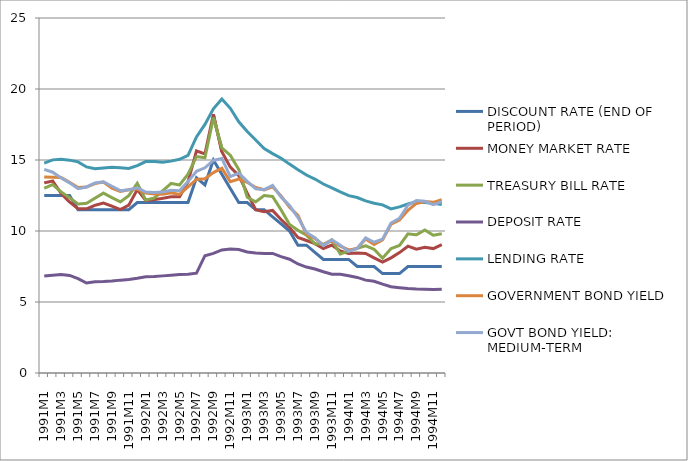
| Category | DISCOUNT RATE (END OF PERIOD) | MONEY MARKET RATE | TREASURY BILL RATE | DEPOSIT RATE | LENDING RATE | GOVERNMENT BOND YIELD | GOVT BOND YIELD: MEDIUM-TERM |
|---|---|---|---|---|---|---|---|
| 1991M1 | 12.5 | 13.39 | 13.01 | 6.83 | 14.78 | 13.8 | 14.34 |
| 1991M2 | 12.5 | 13.52 | 13.27 | 6.89 | 15.01 | 13.78 | 14.14 |
| 1991M3 | 12.5 | 12.64 | 12.75 | 6.94 | 15.05 | 13.77 | 13.73 |
| 1991M4 | 12.5 | 12.04 | 12.34 | 6.87 | 14.99 | 13.43 | 13.39 |
| 1991M5 | 11.5 | 11.57 | 11.9 | 6.65 | 14.87 | 13.06 | 12.98 |
| 1991M6 | 11.5 | 11.56 | 11.95 | 6.34 | 14.51 | 13.09 | 13.1 |
| 1991M7 | 11.5 | 11.81 | 12.31 | 6.42 | 14.38 | 13.34 | 13.38 |
| 1991M8 | 11.5 | 11.97 | 12.67 | 6.44 | 14.44 | 13.45 | 13.47 |
| 1991M9 | 11.5 | 11.75 | 12.35 | 6.48 | 14.49 | 13.02 | 13.15 |
| 1991M10 | 11.5 | 11.51 | 12.05 | 6.54 | 14.45 | 12.79 | 12.84 |
| 1991M11 | 11.5 | 11.82 | 12.49 | 6.58 | 14.41 | 12.91 | 12.91 |
| 1991M12 | 12 | 12.92 | 13.36 | 6.67 | 14.6 | 12.95 | 13.04 |
| 1992M1 | 12 | 12.15 | 12.18 | 6.78 | 14.89 | 12.68 | 12.74 |
| 1992M2 | 12 | 12.21 | 12.32 | 6.8 | 14.9 | 12.61 | 12.72 |
| 1992M3 | 12 | 12.3 | 12.83 | 6.84 | 14.84 | 12.58 | 12.75 |
| 1992M4 | 12 | 12.41 | 13.35 | 6.89 | 14.92 | 12.69 | 12.87 |
| 1992M5 | 12 | 12.41 | 13.24 | 6.93 | 15.05 | 12.58 | 12.83 |
| 1992M6 | 12 | 13.46 | 14 | 6.95 | 15.32 | 13.1 | 13.48 |
| 1992M7 | 13.75 | 15.64 | 15.24 | 7.03 | 16.62 | 13.63 | 14.2 |
| 1992M8 | 13.25 | 15.43 | 15.16 | 8.26 | 17.51 | 13.68 | 14.45 |
| 1992M9 | 15 | 18.22 | 17.98 | 8.42 | 18.61 | 14.11 | 14.97 |
| 1992M10 | 14 | 15.58 | 15.85 | 8.67 | 19.3 | 14.42 | 15.11 |
| 1992M11 | 13 | 14.5 | 15.33 | 8.73 | 18.64 | 13.47 | 13.83 |
| 1992M12 | 12 | 13.9 | 14.33 | 8.69 | 17.69 | 13.66 | 14.08 |
| 1993M1 | 12 | 12.67 | 12.38 | 8.52 | 17 | 13.43 | 13.5 |
| 1993M2 | 11.5 | 11.5 | 12.05 | 8.45 | 16.41 | 13.06 | 12.97 |
| 1993M3 | 11.5 | 11.35 | 12.5 | 8.42 | 15.8 | 12.9 | 12.91 |
| 1993M4 | 11 | 11.45 | 12.43 | 8.42 | 15.45 | 13.11 | 13.21 |
| 1993M5 | 10.5 | 10.81 | 11.49 | 8.2 | 15.13 | 12.46 | 12.39 |
| 1993M6 | 10 | 10.25 | 10.46 | 8.01 | 14.71 | 11.67 | 11.79 |
| 1993M7 | 9 | 9.54 | 10.05 | 7.68 | 14.32 | 11.1 | 10.95 |
| 1993M8 | 9 | 9.33 | 9.71 | 7.46 | 13.94 | 9.76 | 9.9 |
| 1993M9 | 8.5 | 9.11 | 9.1 | 7.32 | 13.66 | 9.47 | 9.53 |
| 1993M10 | 8 | 8.77 | 9.06 | 7.13 | 13.31 | 9.02 | 8.98 |
| 1993M11 | 8 | 9.01 | 9.37 | 6.96 | 13.04 | 9.33 | 9.38 |
| 1993M12 | 8 | 8.59 | 8.38 | 6.95 | 12.75 | 8.93 | 8.99 |
| 1994M1 | 8 | 8.42 | 8.59 | 6.85 | 12.49 | 8.67 | 8.56 |
| 1994M2 | 7.5 | 8.45 | 8.78 | 6.73 | 12.36 | 8.77 | 8.77 |
| 1994M3 | 7.5 | 8.42 | 8.96 | 6.54 | 12.12 | 9.44 | 9.51 |
| 1994M4 | 7.5 | 8.11 | 8.71 | 6.46 | 11.96 | 9.05 | 9.21 |
| 1994M5 | 7 | 7.81 | 8.09 | 6.26 | 11.84 | 9.37 | 9.43 |
| 1994M6 | 7 | 8.11 | 8.76 | 6.08 | 11.56 | 10.48 | 10.56 |
| 1994M7 | 7 | 8.48 | 8.98 | 6.01 | 11.7 | 10.77 | 10.9 |
| 1994M8 | 7.5 | 8.93 | 9.8 | 5.95 | 11.9 | 11.46 | 11.81 |
| 1994M9 | 7.5 | 8.72 | 9.73 | 5.91 | 12.06 | 11.94 | 12.14 |
| 1994M10 | 7.5 | 8.85 | 10.07 | 5.89 | 12 | 12.07 | 12.09 |
| 1994M11 | 7.5 | 8.76 | 9.7 | 5.88 | 11.96 | 12.02 | 11.86 |
| 1994M12 | 7.5 | 9.04 | 9.81 | 5.9 | 11.86 | 12.2 | 12.07 |